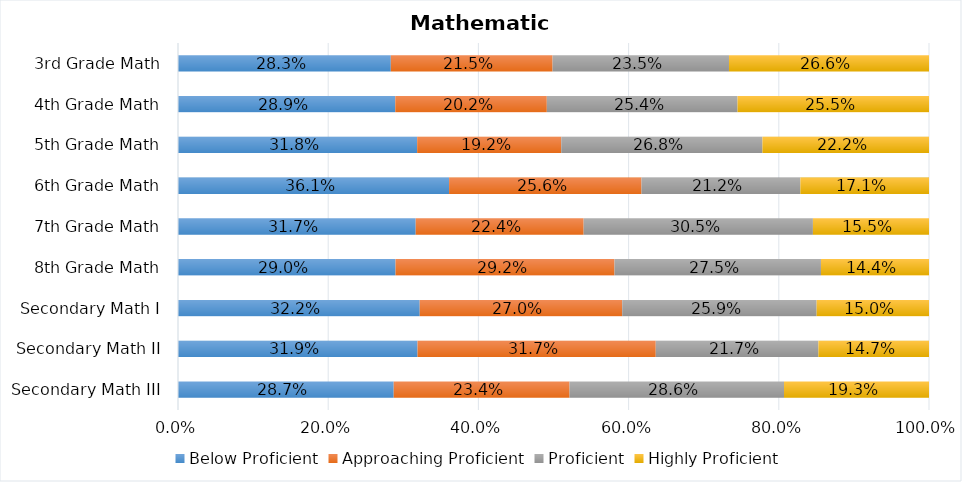
| Category | Below Proficient | Approaching Proficient | Proficient | Highly Proficient |
|---|---|---|---|---|
| Secondary Math III | 0.287 | 0.234 | 0.286 | 0.193 |
| Secondary Math II | 0.319 | 0.317 | 0.217 | 0.147 |
| Secondary Math I | 0.322 | 0.27 | 0.259 | 0.15 |
| 8th Grade Math | 0.29 | 0.292 | 0.275 | 0.144 |
| 7th Grade Math | 0.317 | 0.224 | 0.305 | 0.155 |
| 6th Grade Math | 0.361 | 0.256 | 0.212 | 0.171 |
| 5th Grade Math | 0.318 | 0.192 | 0.268 | 0.222 |
| 4th Grade Math | 0.289 | 0.202 | 0.254 | 0.255 |
| 3rd Grade Math | 0.283 | 0.215 | 0.235 | 0.266 |